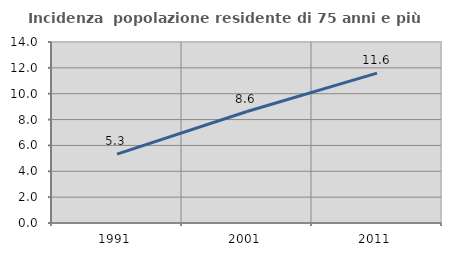
| Category | Incidenza  popolazione residente di 75 anni e più |
|---|---|
| 1991.0 | 5.329 |
| 2001.0 | 8.623 |
| 2011.0 | 11.59 |